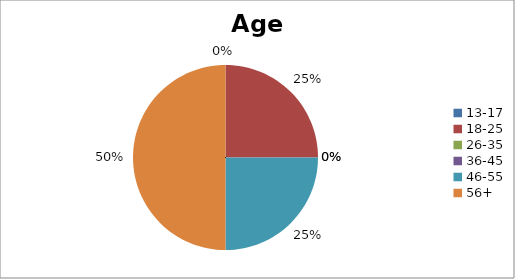
| Category | Age Group |
|---|---|
| 13-17 | 0 |
| 18-25 | 2 |
| 26-35 | 0 |
| 36-45 | 0 |
| 46-55 | 2 |
| 56+ | 4 |